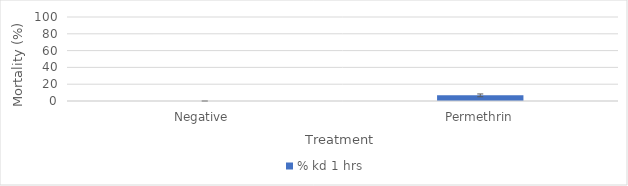
| Category | % kd 1 hrs |
|---|---|
| Negative  | 0 |
| Permethrin | 6.731 |